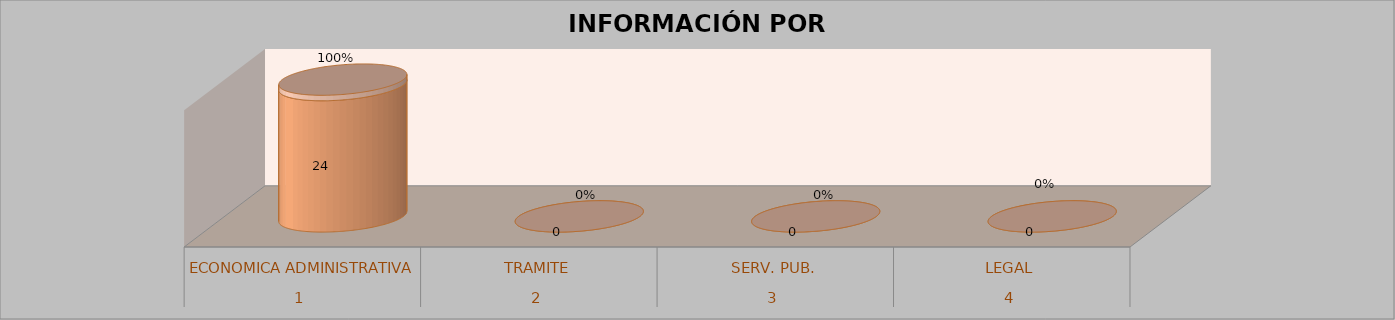
| Category | Series 0 | Series 1 | Series 2 | Series 3 |
|---|---|---|---|---|
| 0 |  |  | 24 | 1 |
| 1 |  |  | 0 | 0 |
| 2 |  |  | 0 | 0 |
| 3 |  |  | 0 | 0 |